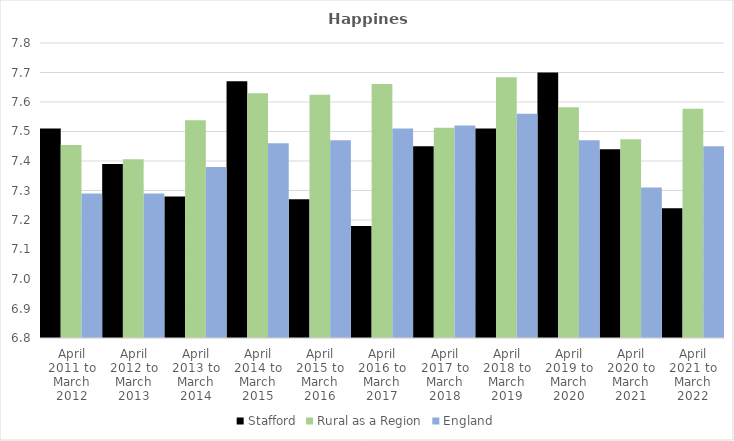
| Category | Stafford | Rural as a Region | England |
|---|---|---|---|
| April 2011 to March 2012 | 7.51 | 7.454 | 7.29 |
| April 2012 to March 2013 | 7.39 | 7.406 | 7.29 |
| April 2013 to March 2014 | 7.28 | 7.539 | 7.38 |
| April 2014 to March 2015 | 7.67 | 7.63 | 7.46 |
| April 2015 to March 2016 | 7.27 | 7.625 | 7.47 |
| April 2016 to March 2017 | 7.18 | 7.661 | 7.51 |
| April 2017 to March 2018 | 7.45 | 7.513 | 7.52 |
| April 2018 to March 2019 | 7.51 | 7.684 | 7.56 |
| April 2019 to March 2020 | 7.7 | 7.582 | 7.47 |
| April 2020 to March 2021 | 7.44 | 7.474 | 7.31 |
| April 2021 to March 2022 | 7.24 | 7.577 | 7.45 |